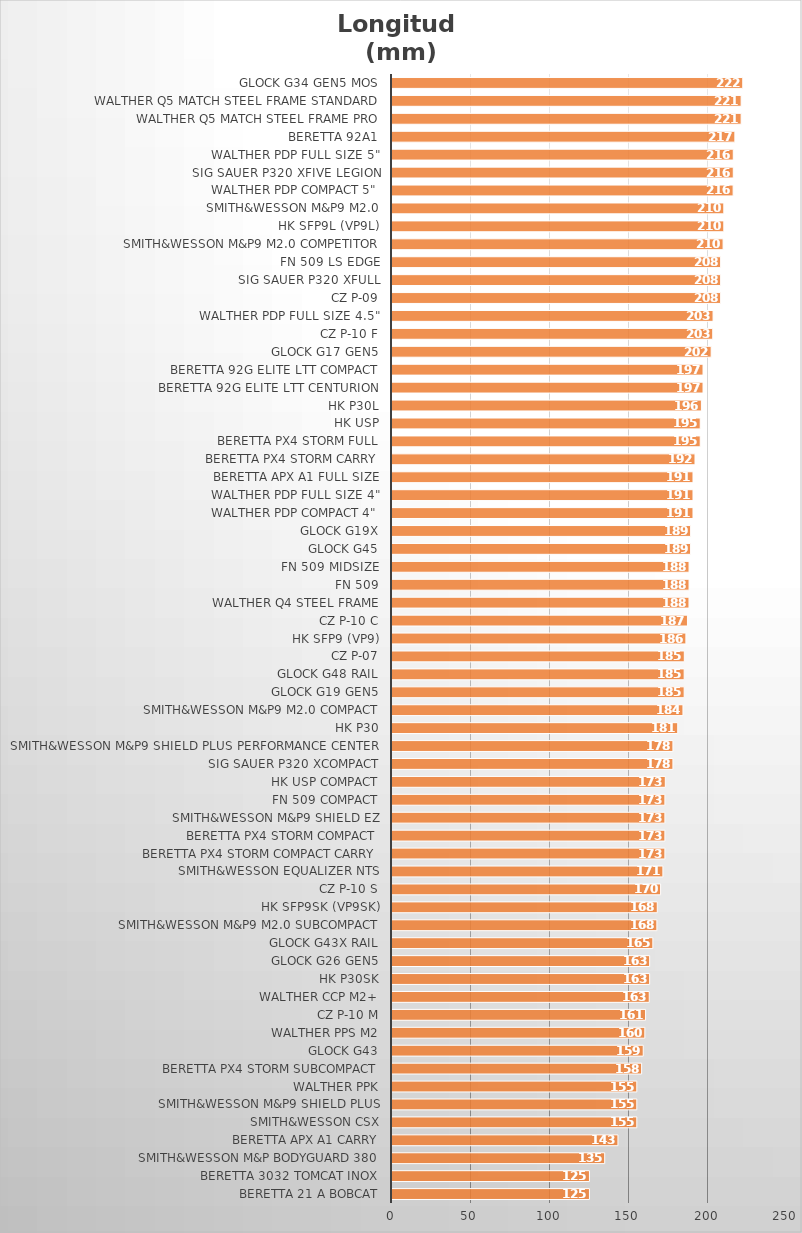
| Category | Longitud 
(mm) |
|---|---|
| Beretta 21 A Bobcat | 124.968 |
| Beretta 3032 Tomcat Inox | 124.968 |
| Smith&Wesson M&P Bodyguard 380 | 134.62 |
| Beretta APX A1 Carry | 143.002 |
| Smith&Wesson CSX | 154.94 |
| Smith&Wesson M&P9 Shield Plus | 154.94 |
| Walther PPK | 154.94 |
| Beretta Px4 Storm SubCompact | 157.988 |
| Glock G43 | 159.004 |
| Walther PPS M2 | 160.02 |
| CZ P-10 M | 160.5 |
| Walther CCP M2+ | 162.814 |
| HK P30SK | 163.068 |
| Glock G26 Gen5 | 163.068 |
| Glock G43X Rail | 165.1 |
| Smith&Wesson M&P9 M2.0 Subcompact | 167.64 |
| HK SFP9SK (VP9SK) | 167.894 |
| CZ P-10 S | 170 |
| Smith&Wesson Equalizer NTS | 171.45 |
| Beretta Px4 Storm Compact Carry | 172.72 |
| Beretta Px4 Storm Compact | 172.72 |
| Smith&Wesson M&P9 Shield EZ | 172.72 |
| FN 509 Compact | 172.72 |
| HK USP Compact | 172.974 |
| SIG Sauer P320 XCOMPACT | 177.8 |
| Smith&Wesson M&P9 Shield Plus Performance Center | 177.8 |
| HK P30 | 180.848 |
| Smith&Wesson M&P9 M2.0 Compact | 184.15 |
| Glock G19 Gen5 | 184.912 |
| Glock G48 Rail | 184.912 |
| CZ P-07 | 185 |
| HK SFP9 (VP9) | 186 |
| CZ P-10 C | 187 |
| Walther Q4 Steel Frame | 187.96 |
| FN 509 | 188 |
| FN 509 Midsize | 188 |
| Glock G45 | 188.976 |
| Glock G19X | 189 |
| Walther PDP Compact 4" | 190.5 |
| Walther PDP Full Size 4" | 190.5 |
| Beretta APX A1 Full Size | 190.5 |
| Beretta Px4 Storm Carry | 191.77 |
| Beretta Px4 Storm Full | 195.072 |
| HK USP | 195.072 |
| HK P30L | 195.834 |
| Beretta 92G Elite LTT Centurion | 196.85 |
| Beretta 92G Elite LTT Compact | 196.85 |
| Glock G17 Gen5 | 202 |
| CZ P-10 F | 203 |
| Walther PDP Full Size 4.5" | 203.2 |
| CZ P-09 | 208 |
| SIG Sauer P320 XFULL | 208 |
| FN 509 LS Edge | 208 |
| Smith&Wesson M&P9 M2.0 Competitor | 209.55 |
| HK SFP9L (VP9L) | 210 |
| Smith&Wesson M&P9 M2.0 | 210 |
| Walther PDP Compact 5" | 215.9 |
| SIG Sauer P320 XFIVE Legion | 216 |
| Walther PDP Full Size 5" | 216 |
| Beretta 92A1 | 217 |
| Walther Q5 Match Steel Frame Pro | 220.98 |
| Walther Q5 Match Steel Frame Standard | 220.98 |
| Glock G34 Gen5 MOS | 221.996 |